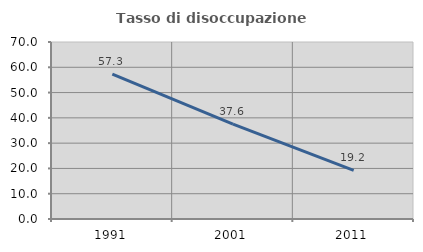
| Category | Tasso di disoccupazione giovanile  |
|---|---|
| 1991.0 | 57.283 |
| 2001.0 | 37.56 |
| 2011.0 | 19.242 |